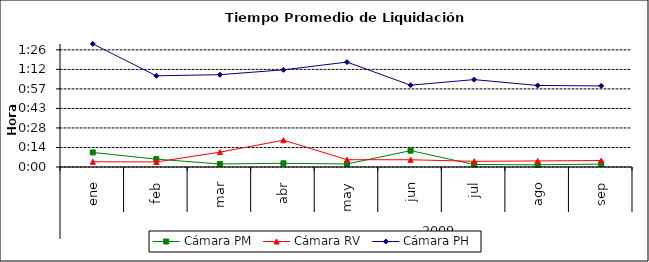
| Category | Cámara PM | Cámara RV | Cámara PH |
|---|---|---|---|
| 0 | 0.007 | 0.003 | 0.063 |
| 1 | 0.004 | 0.003 | 0.047 |
| 2 | 0.002 | 0.008 | 0.047 |
| 3 | 0.002 | 0.014 | 0.05 |
| 4 | 0.002 | 0.004 | 0.054 |
| 5 | 0.008 | 0.004 | 0.042 |
| 6 | 0.001 | 0.003 | 0.045 |
| 7 | 0.001 | 0.003 | 0.042 |
| 8 | 0.001 | 0.003 | 0.042 |